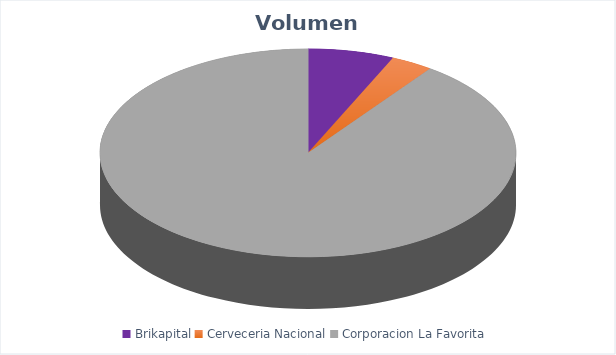
| Category | VOLUMEN ($USD) |
|---|---|
| Brikapital | 7000 |
| Cerveceria Nacional | 3430 |
| Corporacion La Favorita | 94368.78 |